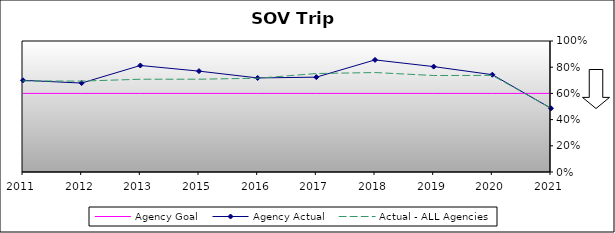
| Category | Agency Goal | Agency Actual | Actual - ALL Agencies |
|---|---|---|---|
| 2011.0 | 0.6 | 0.7 | 0.695 |
| 2012.0 | 0.6 | 0.679 | 0.694 |
| 2013.0 | 0.6 | 0.813 | 0.708 |
| 2015.0 | 0.6 | 0.77 | 0.708 |
| 2016.0 | 0.6 | 0.718 | 0.716 |
| 2017.0 | 0.6 | 0.724 | 0.752 |
| 2018.0 | 0.6 | 0.856 | 0.759 |
| 2019.0 | 0.6 | 0.805 | 0.736 |
| 2020.0 | 0.6 | 0.743 | 0.737 |
| 2021.0 | 0.6 | 0.486 | 0.487 |